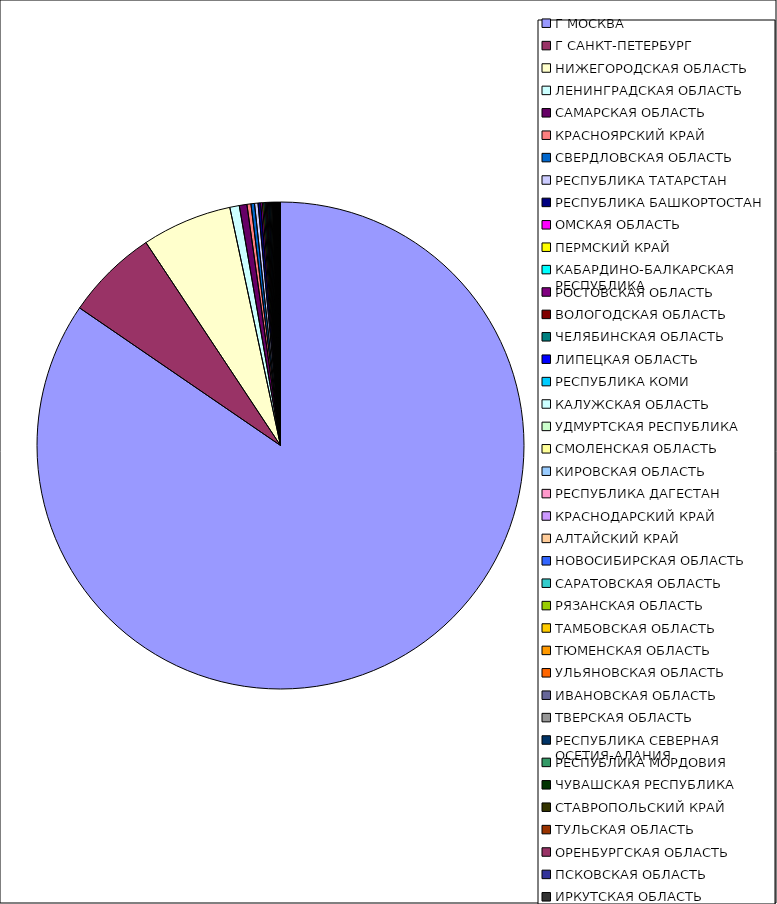
| Category | Оборот |
|---|---|
| Г МОСКВА | 0.845 |
| Г САНКТ-ПЕТЕРБУРГ | 0.061 |
| НИЖЕГОРОДСКАЯ ОБЛАСТЬ | 0.06 |
| ЛЕНИНГРАДСКАЯ ОБЛАСТЬ | 0.006 |
| САМАРСКАЯ ОБЛАСТЬ | 0.005 |
| КРАСНОЯРСКИЙ КРАЙ | 0.003 |
| СВЕРДЛОВСКАЯ ОБЛАСТЬ | 0.002 |
| РЕСПУБЛИКА ТАТАРСТАН | 0.002 |
| РЕСПУБЛИКА БАШКОРТОСТАН | 0.002 |
| ОМСКАЯ ОБЛАСТЬ | 0.001 |
| ПЕРМСКИЙ КРАЙ | 0.001 |
| КАБАРДИНО-БАЛКАРСКАЯ РЕСПУБЛИКА | 0.001 |
| РОСТОВСКАЯ ОБЛАСТЬ | 0.001 |
| ВОЛОГОДСКАЯ ОБЛАСТЬ | 0.001 |
| ЧЕЛЯБИНСКАЯ ОБЛАСТЬ | 0.001 |
| ЛИПЕЦКАЯ ОБЛАСТЬ | 0.001 |
| РЕСПУБЛИКА КОМИ | 0.001 |
| КАЛУЖСКАЯ ОБЛАСТЬ | 0.001 |
| УДМУРТСКАЯ РЕСПУБЛИКА | 0.001 |
| СМОЛЕНСКАЯ ОБЛАСТЬ | 0 |
| КИРОВСКАЯ ОБЛАСТЬ | 0 |
| РЕСПУБЛИКА ДАГЕСТАН | 0 |
| КРАСНОДАРСКИЙ КРАЙ | 0 |
| АЛТАЙСКИЙ КРАЙ | 0 |
| НОВОСИБИРСКАЯ ОБЛАСТЬ | 0 |
| САРАТОВСКАЯ ОБЛАСТЬ | 0 |
| РЯЗАНСКАЯ ОБЛАСТЬ | 0 |
| ТАМБОВСКАЯ ОБЛАСТЬ | 0 |
| ТЮМЕНСКАЯ ОБЛАСТЬ | 0 |
| УЛЬЯНОВСКАЯ ОБЛАСТЬ | 0 |
| ИВАНОВСКАЯ ОБЛАСТЬ | 0 |
| ТВЕРСКАЯ ОБЛАСТЬ | 0 |
| РЕСПУБЛИКА СЕВЕРНАЯ ОСЕТИЯ-АЛАНИЯ | 0 |
| РЕСПУБЛИКА МОРДОВИЯ | 0 |
| ЧУВАШСКАЯ РЕСПУБЛИКА | 0 |
| СТАВРОПОЛЬСКИЙ КРАЙ | 0 |
| ТУЛЬСКАЯ ОБЛАСТЬ | 0 |
| ОРЕНБУРГСКАЯ ОБЛАСТЬ | 0 |
| ПСКОВСКАЯ ОБЛАСТЬ | 0 |
| ИРКУТСКАЯ ОБЛАСТЬ | 0 |
| БЕЛГОРОДСКАЯ ОБЛАСТЬ | 0 |
| МОСКОВСКАЯ ОБЛАСТЬ | 0 |
| РЕСПУБЛИКА САХА(ЯКУТИЯ) | 0 |
| КОСТРОМСКАЯ ОБЛАСТЬ | 0 |